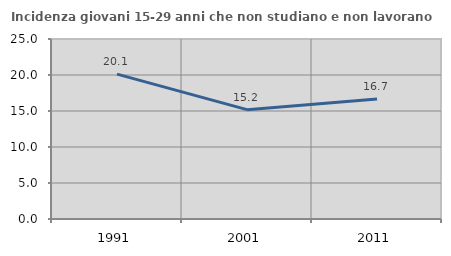
| Category | Incidenza giovani 15-29 anni che non studiano e non lavorano  |
|---|---|
| 1991.0 | 20.125 |
| 2001.0 | 15.185 |
| 2011.0 | 16.667 |